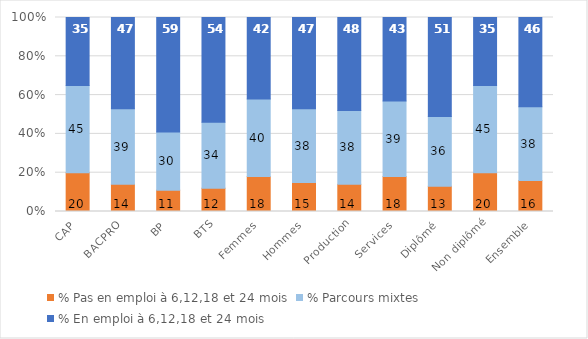
| Category | % Pas en emploi à 6,12,18 et 24 mois | % Parcours mixtes | % En emploi à 6,12,18 et 24 mois |
|---|---|---|---|
| CAP | 20 | 45 | 35 |
| BACPRO | 14 | 39 | 47 |
| BP | 11 | 30 | 59 |
| BTS | 12 | 34 | 54 |
| Femmes | 18 | 40 | 42 |
| Hommes | 15 | 38 | 47 |
| Production | 14 | 38 | 48 |
| Services | 18 | 39 | 43 |
| Diplômé | 13 | 36 | 51 |
| Non diplômé | 20 | 45 | 35 |
| Ensemble | 16 | 38 | 46 |